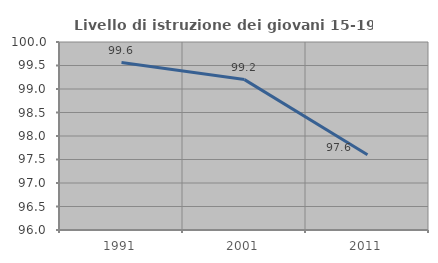
| Category | Livello di istruzione dei giovani 15-19 anni |
|---|---|
| 1991.0 | 99.563 |
| 2001.0 | 99.2 |
| 2011.0 | 97.6 |